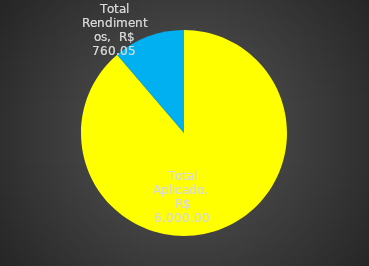
| Category | Series 0 |
|---|---|
| Total Aplicado | 6000 |
| Total Rendimentos | 760.048 |